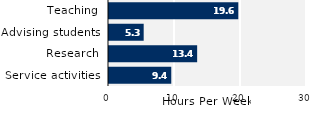
| Category | Series 0 |
|---|---|
| Service activities | 9.435 |
| Research | 13.356 |
| Advising students | 5.255 |
| Teaching | 19.591 |